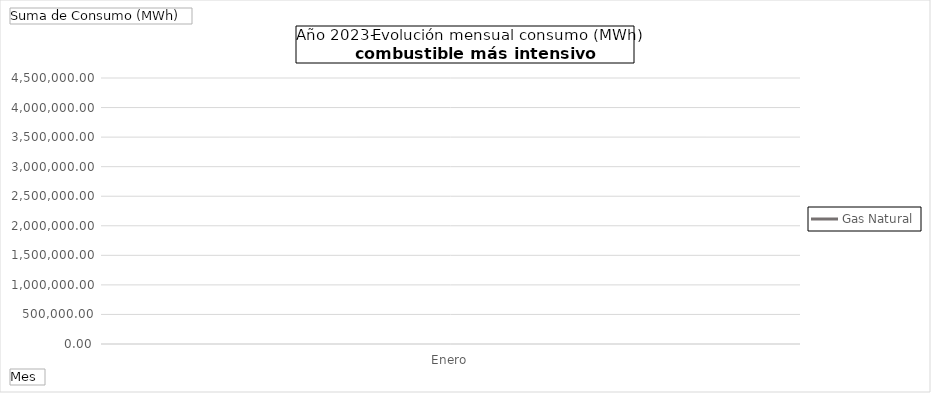
| Category | Gas Natural |
|---|---|
| Enero | 3810883.27 |